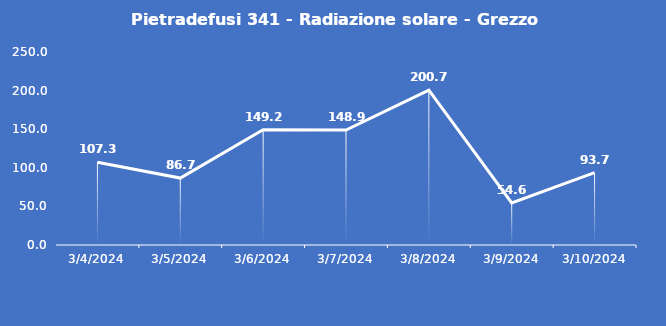
| Category | Pietradefusi 341 - Radiazione solare - Grezzo (W/m2) |
|---|---|
| 3/4/24 | 107.3 |
| 3/5/24 | 86.7 |
| 3/6/24 | 149.2 |
| 3/7/24 | 148.9 |
| 3/8/24 | 200.7 |
| 3/9/24 | 54.6 |
| 3/10/24 | 93.7 |